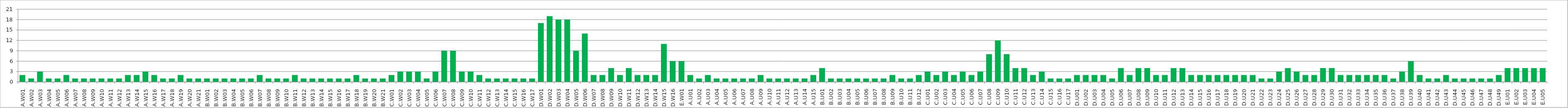
| Category | Series 0 |
|---|---|
| A.W01 | 2 |
| A.W02 | 1 |
| A.W03 | 3 |
| A.W04 | 1 |
| A.W05 | 1 |
| A.W06 | 2 |
| A.W07 | 1 |
| A.W08 | 1 |
| A.W09 | 1 |
| A.W10 | 1 |
| A.W11 | 1 |
| A.W12 | 1 |
| A.W13 | 2 |
| A.W14 | 2 |
| A.W15 | 3 |
| A.W16 | 2 |
| A.W17 | 1 |
| A.W18 | 1 |
| A.W19 | 2 |
| A.W20 | 1 |
| A.W21 | 1 |
| B.W01 | 1 |
| B.W02 | 1 |
| B.W03 | 1 |
| B.W04 | 1 |
| B.W05 | 1 |
| B.W06 | 1 |
| B.W07 | 2 |
| B.W08 | 1 |
| B.W09 | 1 |
| B.W10 | 1 |
| B.W11 | 2 |
| B.W12 | 1 |
| B.W13 | 1 |
| B.W14 | 1 |
| B.W15 | 1 |
| B.W16 | 1 |
| B.W17 | 1 |
| B.W18 | 2 |
| B.W19 | 1 |
| B.W20 | 1 |
| B.W21 | 1 |
| C.W01 | 2 |
| C.W02 | 3 |
| C.W03 | 3 |
| C.W04 | 3 |
| C.W05 | 1 |
| C.W06 | 3 |
| C.W07 | 9 |
| C.W08 | 9 |
| C.W09 | 3 |
| C.W10 | 3 |
| C.W11 | 2 |
| C.W12 | 1 |
| C.W13 | 1 |
| C.W14 | 1 |
| C.W15 | 1 |
| C.W16 | 1 |
| C.W17 | 1 |
| D.W01 | 17 |
| D.W02 | 19 |
| D.W03 | 18 |
| D.W04 | 18 |
| D.W05 | 9 |
| D.W06 | 14 |
| D.W07 | 2 |
| D.W08 | 2 |
| D.W09 | 4 |
| D.W10 | 2 |
| D.W11 | 4 |
| D.W12 | 2 |
| D.W13 | 2 |
| D.W14 | 2 |
| D.W15 | 11 |
| D.W16 | 6 |
| E.W01 | 6 |
| A.U01 | 2 |
| A.U02 | 1 |
| A.U03 | 2 |
| A.U04 | 1 |
| A.U05 | 1 |
| A.U06 | 1 |
| A.U07 | 1 |
| A.U08 | 1 |
| A.U09 | 2 |
| A.U10 | 1 |
| A.U11 | 1 |
| A.U12 | 1 |
| A.U13 | 1 |
| A.U14 | 1 |
| A.U15 | 2 |
| B.U01 | 4 |
| B.U02 | 1 |
| B.U03 | 1 |
| B.U04 | 1 |
| B.U05 | 1 |
| B.U06 | 1 |
| B.U07 | 1 |
| B.U08 | 1 |
| B.U09 | 2 |
| B.U10 | 1 |
| B.U11 | 1 |
| B.U12 | 2 |
| C.U01 | 3 |
| C.U02 | 2 |
| C.U03 | 3 |
| C.U04 | 2 |
| C.U05 | 3 |
| C.U06 | 2 |
| C.U07 | 3 |
| C.U08 | 8 |
| C.U09 | 12 |
| C.U10 | 8 |
| C.U11 | 4 |
| C.U12 | 4 |
| C.U13 | 2 |
| C.U14 | 3 |
| C.U15 | 1 |
| C.U16 | 1 |
| C.U17 | 1 |
| D.U01 | 2 |
| D.U02 | 2 |
| D.U03 | 2 |
| D.U04 | 2 |
| D.U05 | 1 |
| D.U06 | 4 |
| D.U07 | 2 |
| D.U08 | 4 |
| D.U09 | 4 |
| D.U10 | 2 |
| D.U11 | 2 |
| D.U12 | 4 |
| D.U13 | 4 |
| D.U14 | 2 |
| D.U15 | 2 |
| D.U16 | 2 |
| D.U17 | 2 |
| D.U18 | 2 |
| D.U19 | 2 |
| D.U20 | 2 |
| D.U21 | 2 |
| D.U22 | 1 |
| D.U23 | 1 |
| D.U24 | 3 |
| D.U25 | 4 |
| D.U26 | 3 |
| D.U27 | 2 |
| D.U28 | 2 |
| D.U29 | 4 |
| D.U30 | 4 |
| D.U31 | 2 |
| D.U32 | 2 |
| D.U33 | 2 |
| D.U34 | 2 |
| D.U35 | 2 |
| D.U36 | 2 |
| D.U37 | 1 |
| D.U38 | 3 |
| D.U39 | 6 |
| D.U40 | 2 |
| D.U41 | 1 |
| D.U42 | 1 |
| D.U43 | 2 |
| D.U44 | 1 |
| D.U45 | 1 |
| D.U46 | 1 |
| D.U47 | 1 |
| D.U48 | 1 |
| D.U49 | 2 |
| E.U01 | 4 |
| E.U02 | 4 |
| E.U03 | 4 |
| E.U04 | 4 |
| E.U05 | 4 |